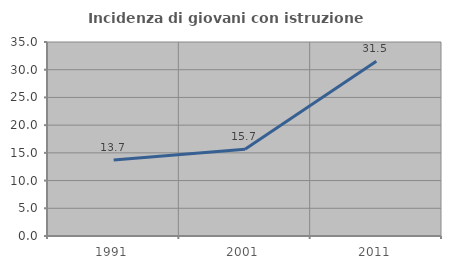
| Category | Incidenza di giovani con istruzione universitaria |
|---|---|
| 1991.0 | 13.712 |
| 2001.0 | 15.663 |
| 2011.0 | 31.513 |